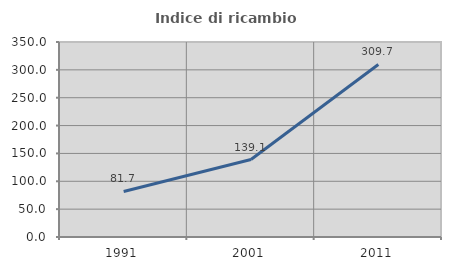
| Category | Indice di ricambio occupazionale  |
|---|---|
| 1991.0 | 81.726 |
| 2001.0 | 139.08 |
| 2011.0 | 309.677 |